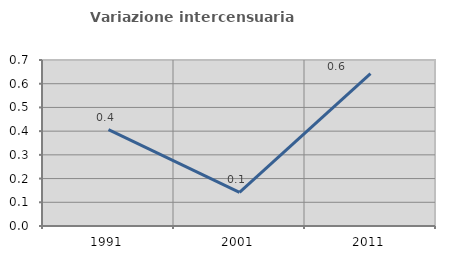
| Category | Variazione intercensuaria annua |
|---|---|
| 1991.0 | 0.407 |
| 2001.0 | 0.142 |
| 2011.0 | 0.643 |